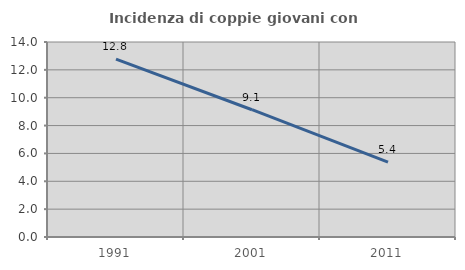
| Category | Incidenza di coppie giovani con figli |
|---|---|
| 1991.0 | 12.774 |
| 2001.0 | 9.138 |
| 2011.0 | 5.382 |